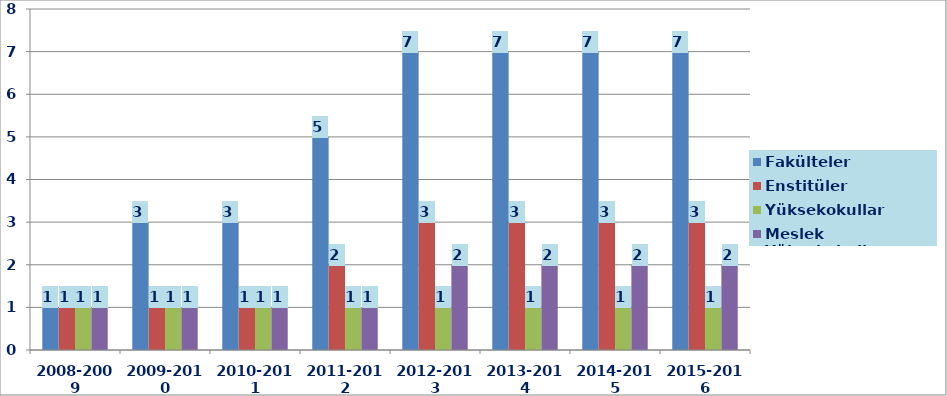
| Category | Fakülteler | Enstitüler | Yüksekokullar | Meslek Yüksekokulları |
|---|---|---|---|---|
| 2008-2009 | 1 | 1 | 1 | 1 |
| 2009-2010 | 3 | 1 | 1 | 1 |
| 2010-2011 | 3 | 1 | 1 | 1 |
| 2011-2012 | 5 | 2 | 1 | 1 |
| 2012-2013 | 7 | 3 | 1 | 2 |
| 2013-2014 | 7 | 3 | 1 | 2 |
| 2014-2015 | 7 | 3 | 1 | 2 |
| 2015-2016 | 7 | 3 | 1 | 2 |